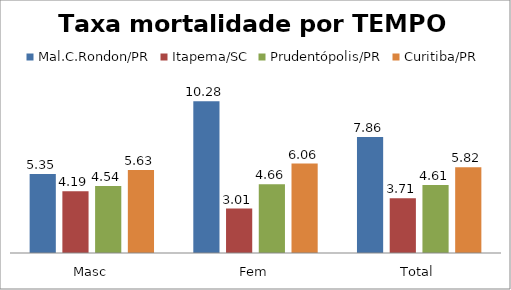
| Category | Mal.C.Rondon/PR | Itapema/SC | Prudentópolis/PR | Toledo/PR | Cascavel/PR | Curitiba/PR |
|---|---|---|---|---|---|---|
| Masc | 5.35 | 4.19 | 4.54 |  |  | 5.63 |
| Fem | 10.28 | 3.01 | 4.66 |  |  | 6.06 |
| Total | 7.86 | 3.71 | 4.61 |  |  | 5.82 |